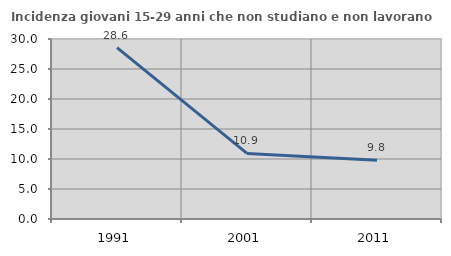
| Category | Incidenza giovani 15-29 anni che non studiano e non lavorano  |
|---|---|
| 1991.0 | 28.571 |
| 2001.0 | 10.925 |
| 2011.0 | 9.799 |